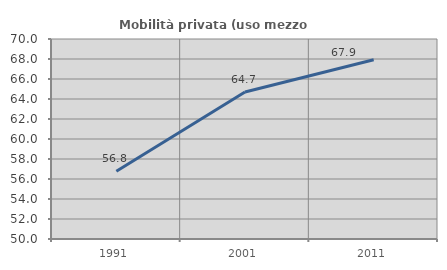
| Category | Mobilità privata (uso mezzo privato) |
|---|---|
| 1991.0 | 56.779 |
| 2001.0 | 64.704 |
| 2011.0 | 67.919 |